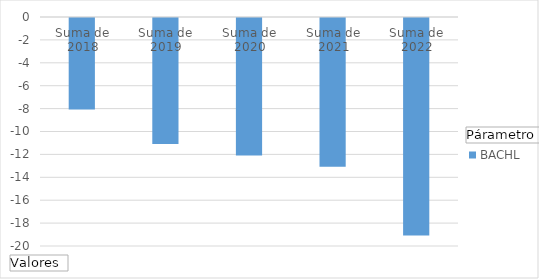
| Category | BACHL |
|---|---|
| Suma de 2018 | -8 |
| Suma de 2019 | -11 |
| Suma de 2020 | -12 |
| Suma de 2021 | -13 |
| Suma de 2022 | -19 |